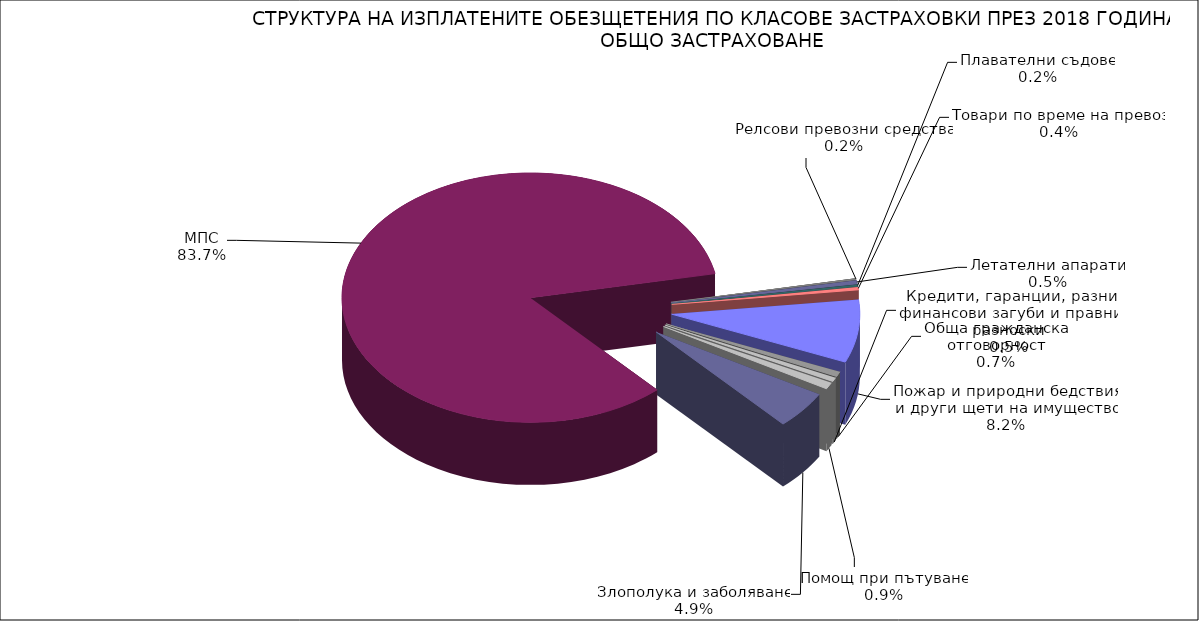
| Category | Series 0 |
|---|---|
| Злополука и заболяване | 0.049 |
| МПС | 0.837 |
| Релсови превозни средства | 0.002 |
| Летателни апарати | 0.005 |
| Плавателни съдове | 0.002 |
| Товари по време на превоз | 0.004 |
| Пожар и природни бедствия и други щети на имущество | 0.082 |
| Обща гражданска отговорност | 0.007 |
| Кредити, гаранции, разни финансови загуби и правни разноски | 0.005 |
| Помощ при пътуване | 0.009 |